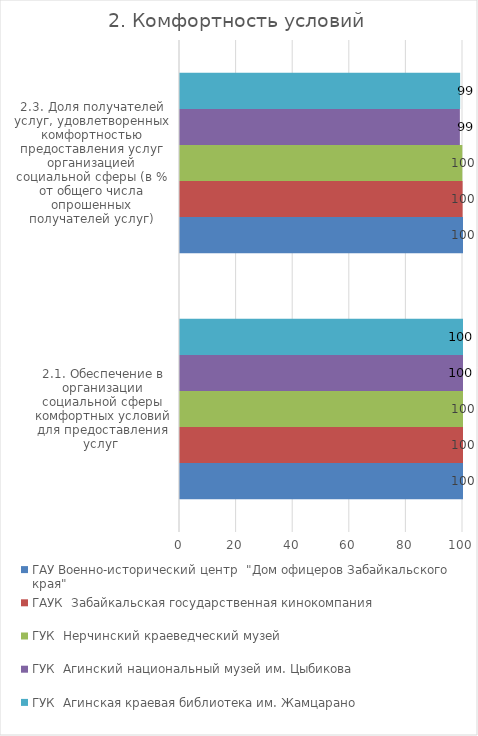
| Category | ГАУ Военно-исторический центр  "Дом офицеров Забайкальского края"  | ГАУК  Забайкальская государственная кинокомпания  | ГУК  Нерчинский краеведческий музей  | ГУК  Агинский национальный музей им. Цыбикова  | ГУК  Агинская краевая библиотека им. Жамцарано  |
|---|---|---|---|---|---|
| 2.1. Обеспечение в организации социальной сферы комфортных условий для предоставления услуг  | 100 | 100 | 100 | 100 | 100 |
| 2.3. Доля получателей услуг, удовлетворенных комфортностью предоставления услуг организацией социальной сферы (в % от общего числа опрошенных получателей услуг) | 100 | 99.866 | 99.762 | 98.899 | 98.991 |